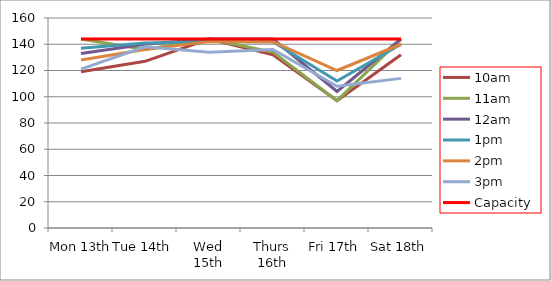
| Category | 9am | 10am | 11am | 12am | 1pm | 2pm | 3pm | 4pm | 5pm | Capacity |
|---|---|---|---|---|---|---|---|---|---|---|
| Mon 13th |  | 119 | 144 | 133 | 137 | 128 | 121 |  |  | 144 |
| Tue 14th |  | 127 | 136 | 140 | 141 | 136 | 138 |  |  | 144 |
| Wed 15th |  | 144 | 144 | 144 | 142 | 142 | 134 |  |  | 144 |
| Thurs 16th |  | 132 | 134 | 144 | 142 | 142 | 136 |  |  | 144 |
| Fri 17th |  | 97 | 97 | 104 | 112 | 120 | 108 |  |  | 144 |
| Sat 18th |  | 132 | 144 | 144 | 140 | 140 | 114 |  |  | 144 |